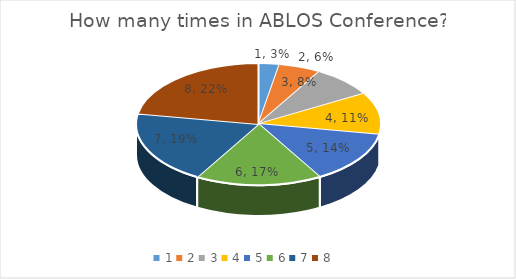
| Category | Series 0 | Series 1 |
|---|---|---|
| 0 | 1 | 14 |
| 1 | 2 | 8 |
| 2 | 3 | 3 |
| 3 | 4 | 0 |
| 4 | 5 | 2 |
| 5 | 6 | 2 |
| 6 | 7 | 0 |
| 7 | 8 | 1 |